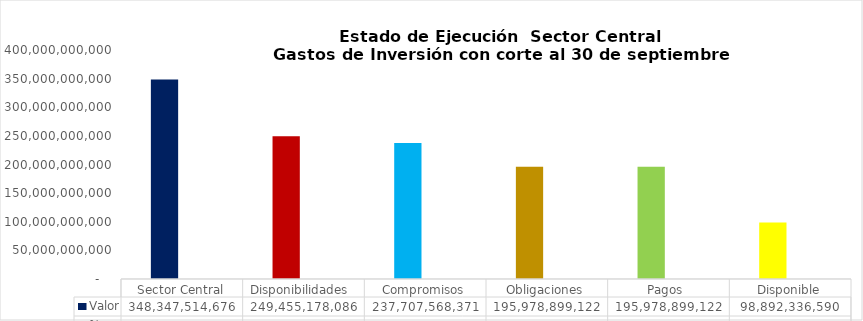
| Category | Valor | % |
|---|---|---|
| Sector Central | 348347514675.74 | 1 |
| Disponibilidades  | 249455178085.91 | 0.716 |
| Compromisos | 237707568371.31 | 0.682 |
| Obligaciones | 195978899122.16 | 0.824 |
| Pagos  | 195978899122.16 | 0.824 |
| Disponible | 98892336589.83 | 0.284 |